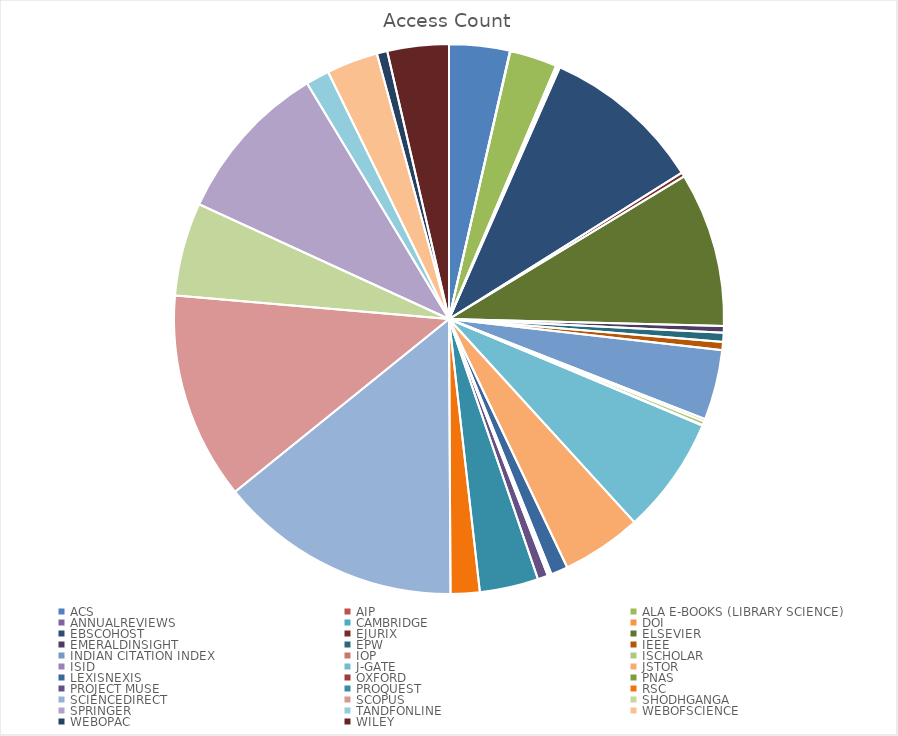
| Category | Access Count |
|---|---|
| ACS | 649 |
| AIP | 5 |
| ALA E-BOOKS (LIBRARY SCIENCE) | 507 |
| ANNUALREVIEWS | 18 |
| CAMBRIDGE | 6 |
| DOI | 19 |
| EBSCOHOST | 1726 |
| EJURIX | 46 |
| ELSEVIER | 1656 |
| EMERALDINSIGHT | 71 |
| EPW | 97 |
| IEEE | 87 |
| INDIAN CITATION INDEX | 752 |
| IOP | 26 |
| ISCHOLAR | 42 |
| ISID | 6 |
| J-GATE | 1256 |
| JSTOR | 857 |
| LEXISNEXIS | 181 |
| OXFORD | 20 |
| PNAS | 21 |
| PROJECT MUSE | 111 |
| PROQUEST | 629 |
| RSC | 311 |
| SCIENCEDIRECT | 2602 |
| SCOPUS | 2221 |
| SHODHGANGA | 999 |
| SPRINGER | 1736 |
| TANDFONLINE | 252 |
| WEBOFSCIENCE | 551 |
| WEBOPAC | 112 |
| WILEY | 658 |